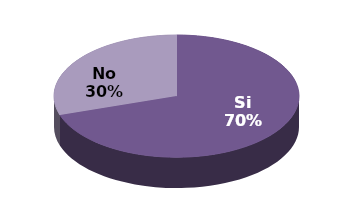
| Category | Series 1 | Series 0 |
|---|---|---|
| Si | 7 | 70 |
| No | 3 | 30 |